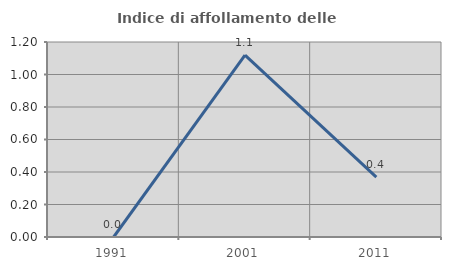
| Category | Indice di affollamento delle abitazioni  |
|---|---|
| 1991.0 | 0 |
| 2001.0 | 1.119 |
| 2011.0 | 0.369 |